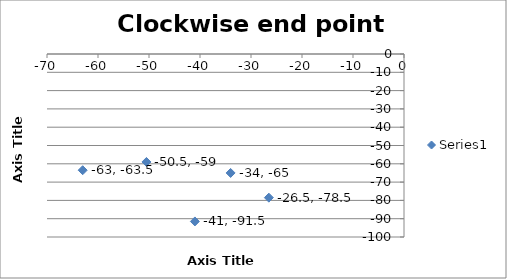
| Category | Series 0 |
|---|---|
| -63.0 | -63.5 |
| -50.5 | -59 |
| -34.0 | -65 |
| -26.5 | -78.5 |
| -41.0 | -91.5 |